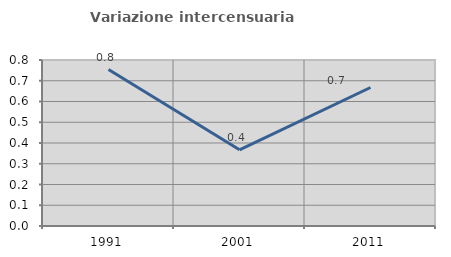
| Category | Variazione intercensuaria annua |
|---|---|
| 1991.0 | 0.754 |
| 2001.0 | 0.367 |
| 2011.0 | 0.667 |